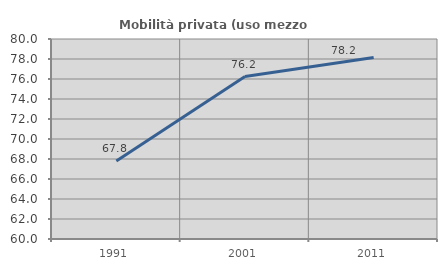
| Category | Mobilità privata (uso mezzo privato) |
|---|---|
| 1991.0 | 67.794 |
| 2001.0 | 76.244 |
| 2011.0 | 78.16 |